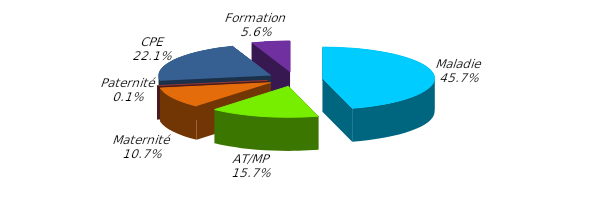
| Category | Series 0 |
|---|---|
| Maladie | 5504118.2 |
| AT/MP | 1894961.271 |
| Maternité | 1293757.14 |
| Paternité | 9166.17 |
| CPE | 2665630.078 |
| Formation | 668061.29 |